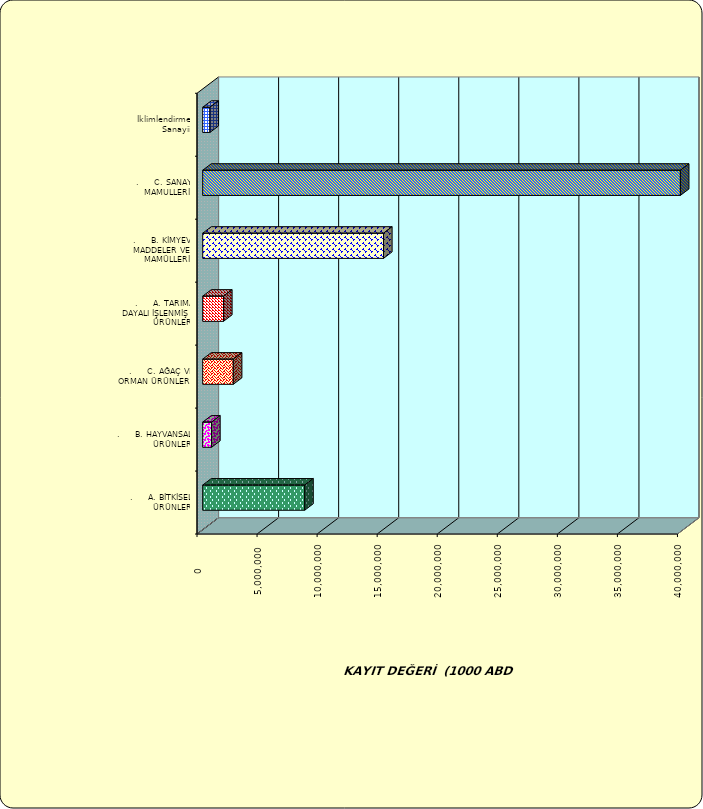
| Category | Series 0 |
|---|---|
| .     A. BİTKİSEL ÜRÜNLER | 8490697.586 |
| .     B. HAYVANSAL ÜRÜNLER | 739978.662 |
| .     C. AĞAÇ VE ORMAN ÜRÜNLERİ | 2547974.728 |
| .     A. TARIMA DAYALI İŞLENMİŞ ÜRÜNLER | 1731575.741 |
| .     B. KİMYEVİ MADDELER VE MAMÜLLERİ | 15053352.24 |
| .     C. SANAYİ MAMULLERİ | 39769315.262 |
|  İklimlendirme Sanayii | 601790.679 |